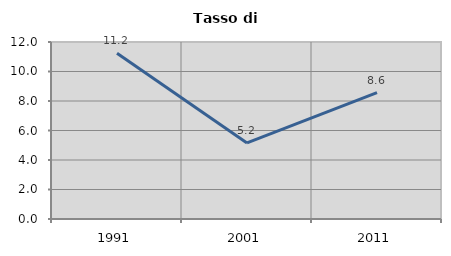
| Category | Tasso di disoccupazione   |
|---|---|
| 1991.0 | 11.236 |
| 2001.0 | 5.155 |
| 2011.0 | 8.571 |